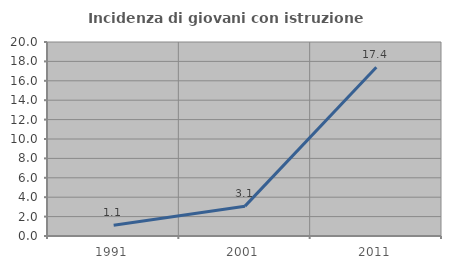
| Category | Incidenza di giovani con istruzione universitaria |
|---|---|
| 1991.0 | 1.111 |
| 2001.0 | 3.077 |
| 2011.0 | 17.391 |